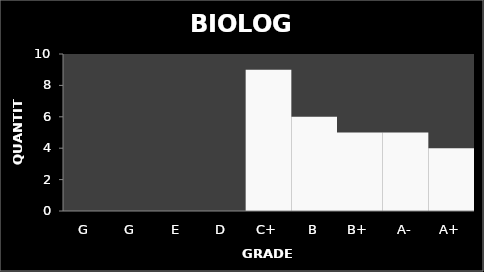
| Category | Quantity |
|---|---|
| G | 0 |
| G | 0 |
| E | 0 |
| D | 0 |
| C+ | 9 |
| B | 6 |
| B+ | 5 |
| A- | 5 |
| A+ | 4 |